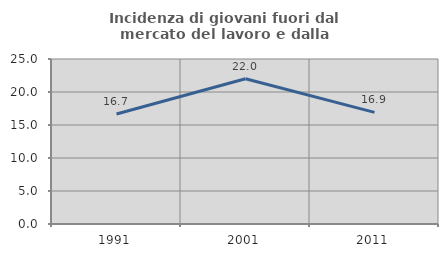
| Category | Incidenza di giovani fuori dal mercato del lavoro e dalla formazione  |
|---|---|
| 1991.0 | 16.667 |
| 2001.0 | 22.005 |
| 2011.0 | 16.917 |